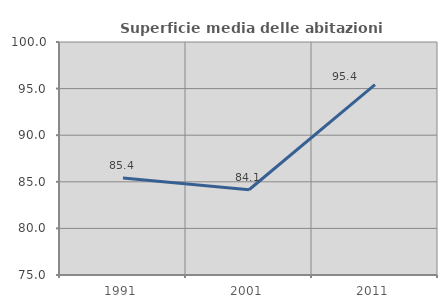
| Category | Superficie media delle abitazioni occupate |
|---|---|
| 1991.0 | 85.403 |
| 2001.0 | 84.145 |
| 2011.0 | 95.419 |